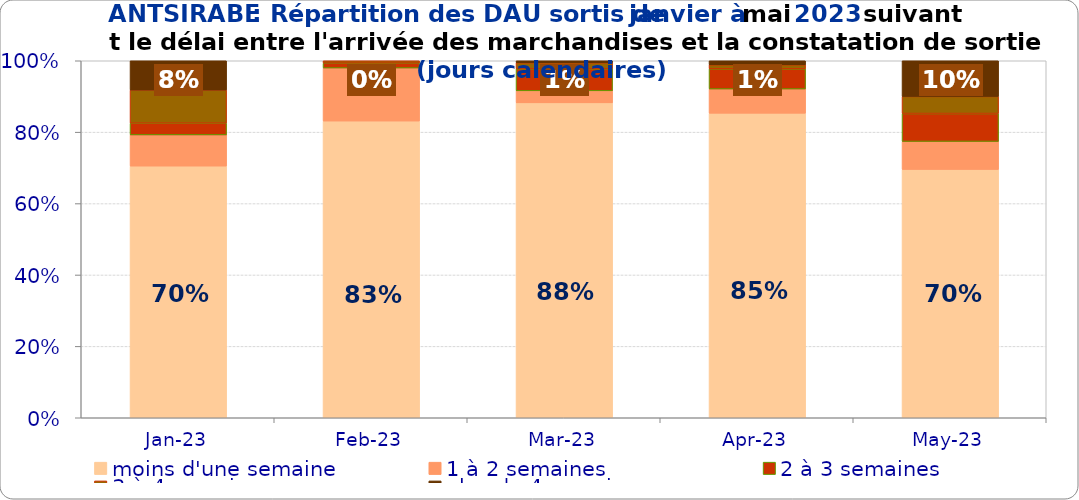
| Category | moins d'une semaine | 1 à 2 semaines | 2 à 3 semaines | 3 à 4 semaines | plus de 4 semaines |
|---|---|---|---|---|---|
| 2023-01-01 | 0.705 | 0.087 | 0.033 | 0.093 | 0.082 |
| 2023-02-01 | 0.831 | 0.149 | 0.014 | 0.007 | 0 |
| 2023-03-01 | 0.882 | 0.034 | 0.062 | 0.017 | 0.006 |
| 2023-04-01 | 0.853 | 0.068 | 0.056 | 0.011 | 0.011 |
| 2023-05-01 | 0.696 | 0.078 | 0.078 | 0.048 | 0.1 |